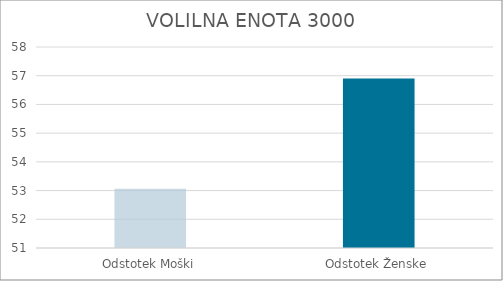
| Category | Series 0 |
|---|---|
| Odstotek Moški | 53.06 |
| Odstotek Ženske | 56.9 |